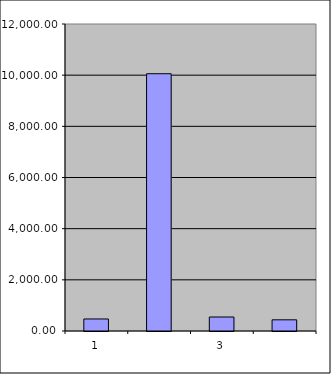
| Category | Series 0 |
|---|---|
| 0 | 470 |
| 1 | 10056.41 |
| 2 | 546.622 |
| 3 | 436.935 |